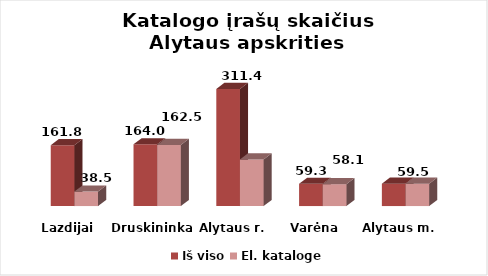
| Category | Iš viso | El. kataloge |
|---|---|---|
| Lazdijai | 161.8 | 38.5 |
| Druskininkai | 164 | 162.5 |
| Alytaus r. | 311.4 | 123.9 |
| Varėna | 59.3 | 58.1 |
| Alytaus m. | 59.5 | 59.5 |